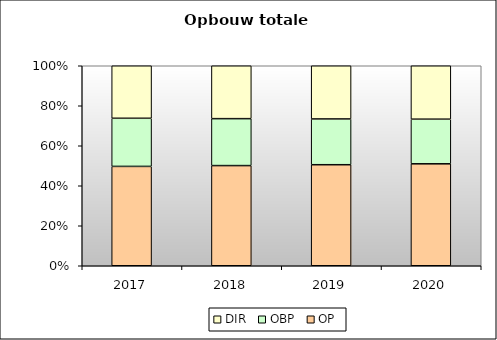
| Category | OP | OBP | DIR |
|---|---|---|---|
| 2017.0 | 123609.662 | 59875.2 | 65345.94 |
| 2018.0 | 127766.266 | 59875.2 | 67464.9 |
| 2019.0 | 132168.632 | 59875.2 | 69575.76 |
| 2020.0 | 136766.747 | 59875.2 | 71683.38 |